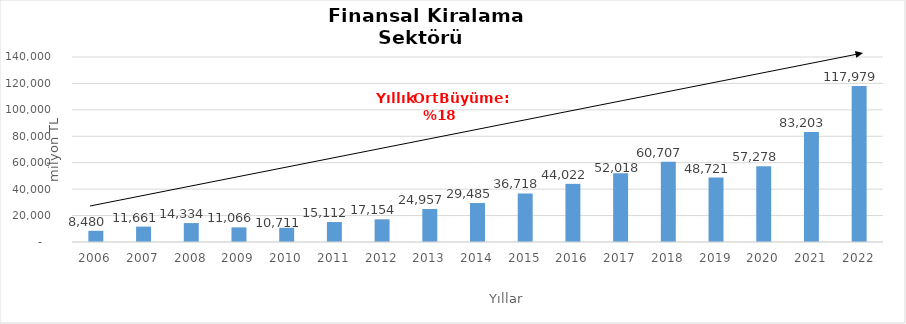
| Category | Finansal Kiralama  |
|---|---|
| 2006.0 | 8479.947 |
| 2007.0 | 11660.58 |
| 2008.0 | 14333.808 |
| 2009.0 | 11065.67 |
| 2010.0 | 10710.722 |
| 2011.0 | 15112.153 |
| 2012.0 | 17154.47 |
| 2013.0 | 24957.48 |
| 2014.0 | 29485.282 |
| 2015.0 | 36718 |
| 2016.0 | 44022 |
| 2017.0 | 52018 |
| 2018.0 | 60707 |
| 2019.0 | 48721 |
| 2020.0 | 57278 |
| 2021.0 | 83203 |
| 2022.0 | 117979 |